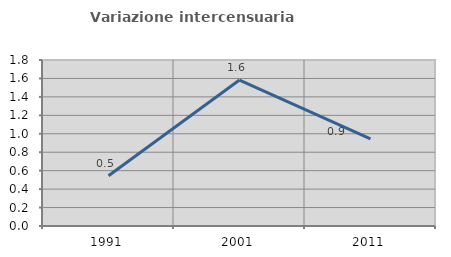
| Category | Variazione intercensuaria annua |
|---|---|
| 1991.0 | 0.546 |
| 2001.0 | 1.582 |
| 2011.0 | 0.944 |